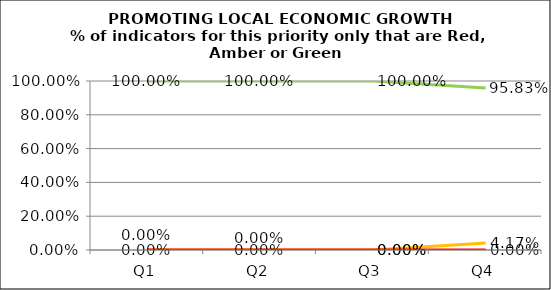
| Category | Green | Amber | Red |
|---|---|---|---|
| Q1 | 1 | 0 | 0 |
| Q2 | 1 | 0 | 0 |
| Q3 | 1 | 0 | 0 |
| Q4 | 0.958 | 0.042 | 0 |